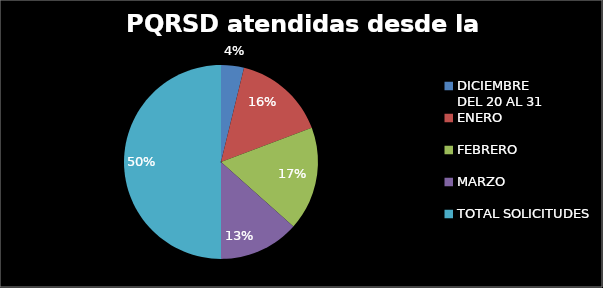
| Category |  PQRSD atendidas desde la UAC |
|---|---|
| DICIEMBRE 
DEL 20 AL 31 | 86 |
| ENERO | 348 |
| FEBRERO | 390 |
| MARZO | 302 |
| TOTAL SOLICITUDES | 1126 |